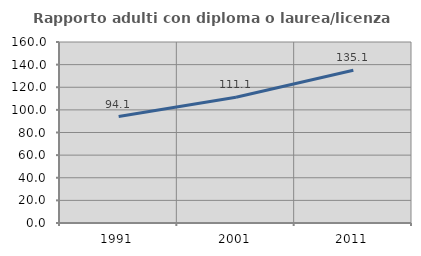
| Category | Rapporto adulti con diploma o laurea/licenza media  |
|---|---|
| 1991.0 | 94.113 |
| 2001.0 | 111.132 |
| 2011.0 | 135.084 |